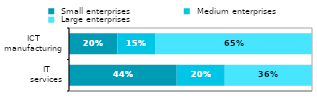
| Category |  Small enterprises |  Medium enterprises |  Large enterprises |
|---|---|---|---|
|  IT 
services | 0.443 | 0.198 | 0.359 |
|  ICT 
manufacturing | 0.199 | 0.155 | 0.646 |